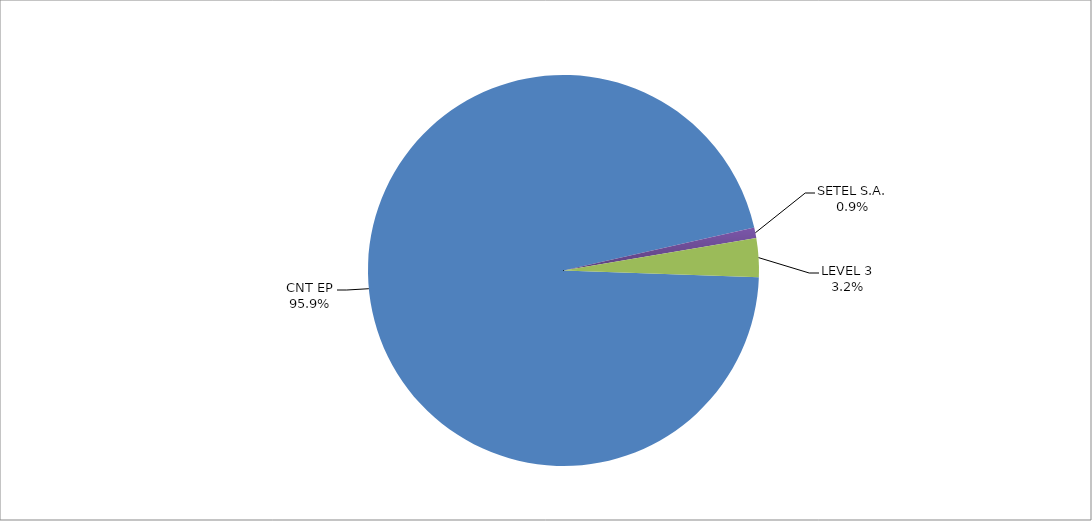
| Category | Series 0 |
|---|---|
| CNT EP | 329 |
| SETEL S.A. | 3 |
| LEVEL 3 | 11 |